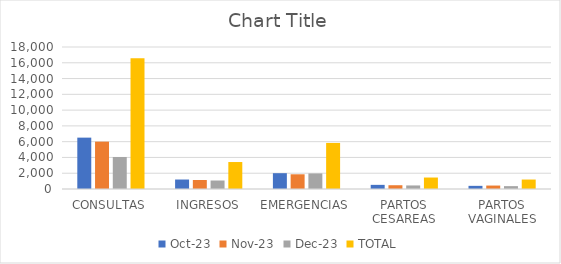
| Category | oct-23 | nov-23 | dic-23 | TOTAL |
|---|---|---|---|---|
| CONSULTAS | 6512 | 6003 | 4057 | 16572 |
| INGRESOS | 1201 | 1142 | 1076 | 3419 |
| EMERGENCIAS | 2005 | 1864 | 1972 | 5841 |
| PARTOS CESAREAS | 525 | 478 | 451 | 1454 |
| PARTOS VAGINALES | 399 | 437 | 363 | 1199 |